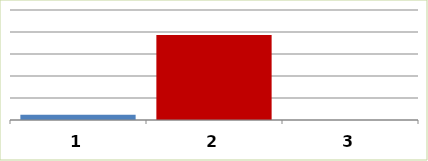
| Category | Series 0 |
|---|---|
| 0 | 121672.95 |
| 1 | 1929674.5 |
| 2 | 0 |